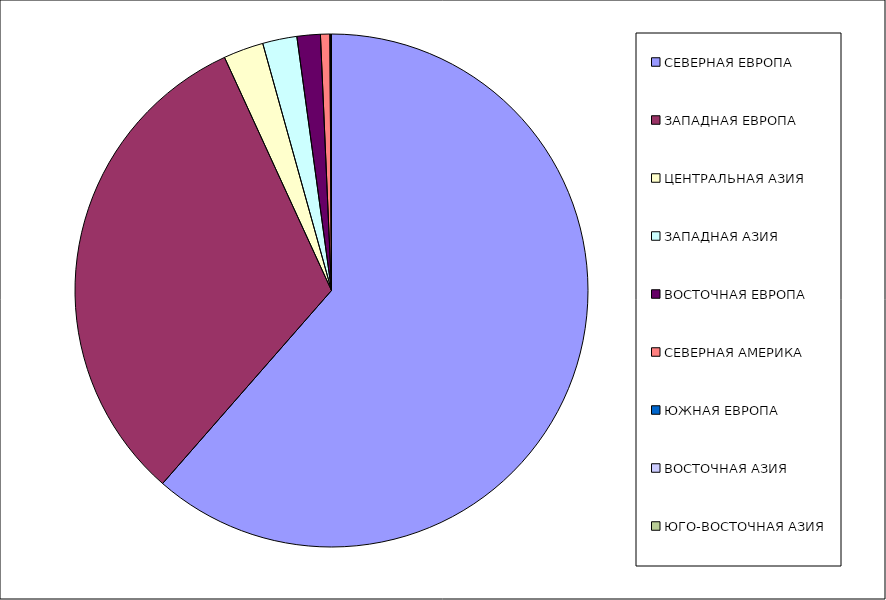
| Category | Оборот |
|---|---|
| СЕВЕРНАЯ ЕВРОПА | 61.44 |
| ЗАПАДНАЯ ЕВРОПА | 31.71 |
| ЦЕНТРАЛЬНАЯ АЗИЯ | 2.529 |
| ЗАПАДНАЯ АЗИЯ | 2.161 |
| ВОСТОЧНАЯ ЕВРОПА | 1.47 |
| СЕВЕРНАЯ АМЕРИКА | 0.59 |
| ЮЖНАЯ ЕВРОПА | 0.051 |
| ВОСТОЧНАЯ АЗИЯ | 0.047 |
| ЮГО-ВОСТОЧНАЯ АЗИЯ | 0 |